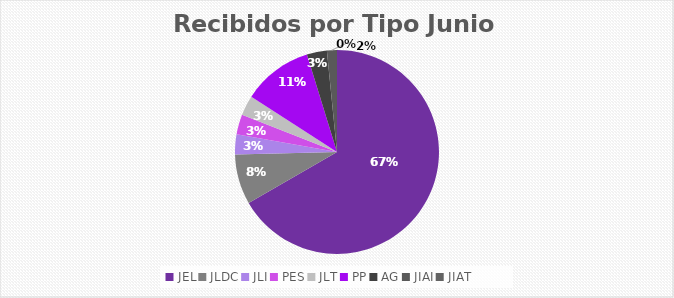
| Category | Series 0 |
|---|---|
| JEL | 42 |
| JLDC | 5 |
| JLI | 2 |
| PES | 2 |
| JLT | 2 |
| PP | 7 |
| AG | 2 |
| JIAI | 1 |
| JIAT | 0 |